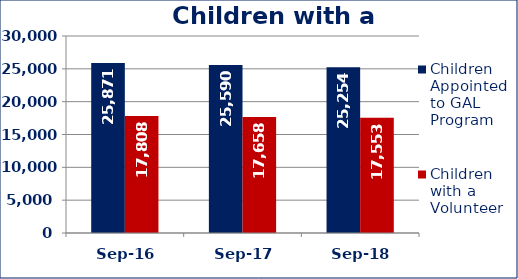
| Category | Children Appointed to GAL Program  | Children with a Volunteer  |
|---|---|---|
| Sep-16 | 25871 | 17808 |
| Sep-17 | 25590 | 17658 |
| Sep-18 | 25254 | 17553 |